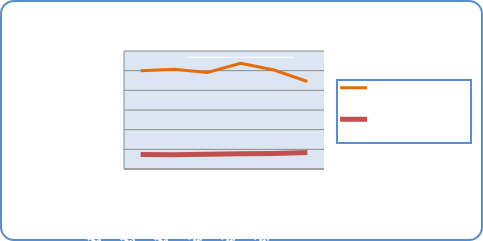
| Category | Motorin Türleri  | Benzin Türleri |
|---|---|---|
| 1/29/18 | 49968189.389 | 7312504.864 |
| 1/30/18 | 50758698.19 | 7262760.157 |
| 1/31/18 | 49073327.329 | 7484950.009 |
| 2/1/18 | 53733267.457 | 7752626.769 |
| 2/2/18 | 50304652.718 | 7901801.683 |
| 2/3/18 | 44489015.818 | 8375956.135 |